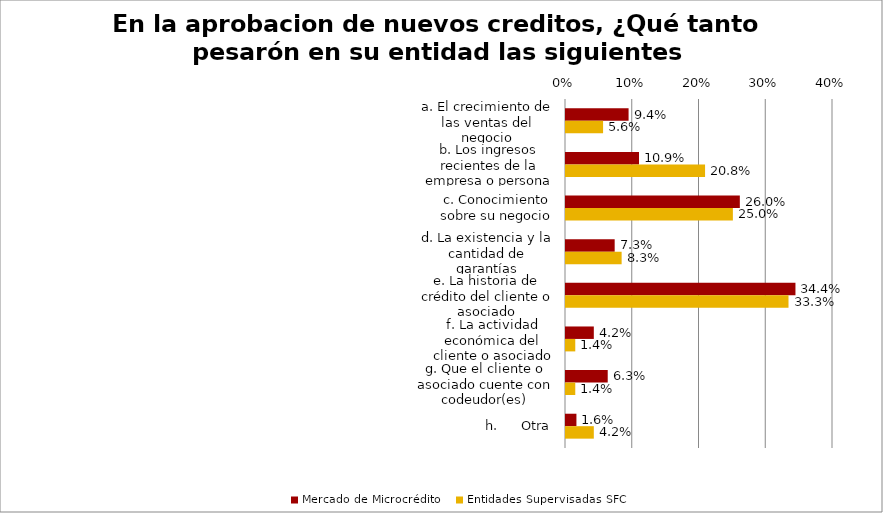
| Category | Mercado de Microcrédito | Entidades Supervisadas SFC |
|---|---|---|
| a. El crecimiento de las ventas del negocio | 0.094 | 0.056 |
| b. Los ingresos recientes de la empresa o persona natural | 0.109 | 0.208 |
| c. Conocimiento sobre su negocio | 0.26 | 0.25 |
| d. La existencia y la cantidad de garantías | 0.073 | 0.083 |
| e. La historia de crédito del cliente o asociado | 0.344 | 0.333 |
| f. La actividad económica del cliente o asociado | 0.042 | 0.014 |
| g. Que el cliente o asociado cuente con codeudor(es) | 0.062 | 0.014 |
| h.      Otra | 0.016 | 0.042 |